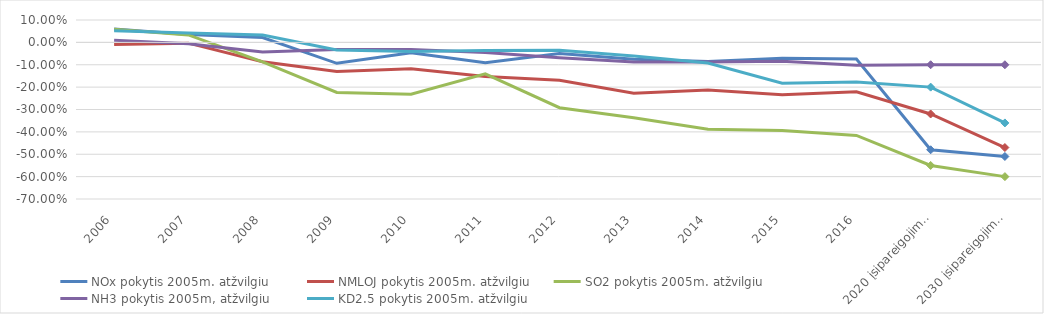
| Category | NOx pokytis 2005m. atžvilgiu | NMLOJ pokytis 2005m. atžvilgiu | SO2 pokytis 2005m. atžvilgiu | NH3 pokytis 2005m, atžvilgiu | KD2.5 pokytis 2005m. atžvilgiu |
|---|---|---|---|---|---|
| 2006 | 0.06 | -0.01 | 0.059 | 0.009 | 0.052 |
| 2007 | 0.035 | -0.003 | 0.033 | -0.006 | 0.042 |
| 2008 | 0.021 | -0.087 | -0.087 | -0.043 | 0.033 |
| 2009 | -0.094 | -0.13 | -0.224 | -0.032 | -0.034 |
| 2010 | -0.047 | -0.118 | -0.232 | -0.032 | -0.041 |
| 2011 | -0.091 | -0.153 | -0.141 | -0.046 | -0.037 |
| 2012 | -0.05 | -0.169 | -0.292 | -0.069 | -0.036 |
| 2013 | -0.075 | -0.228 | -0.337 | -0.088 | -0.061 |
| 2014 | -0.085 | -0.213 | -0.388 | -0.088 | -0.092 |
| 2015 | -0.07 | -0.234 | -0.394 | -0.084 | -0.183 |
| 2016 | -0.075 | -0.221 | -0.416 | -0.103 | -0.177 |
| 2020 įsipareigojimai | -0.48 | -0.32 | -0.55 | -0.1 | -0.2 |
| 2030 įsipareigojimai | -0.51 | -0.47 | -0.6 | -0.1 | -0.36 |